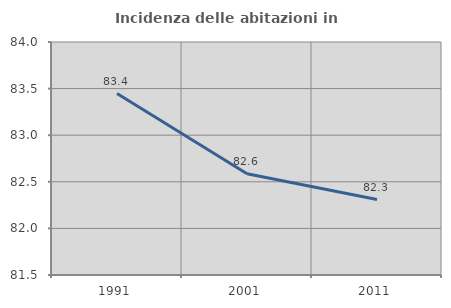
| Category | Incidenza delle abitazioni in proprietà  |
|---|---|
| 1991.0 | 83.447 |
| 2001.0 | 82.587 |
| 2011.0 | 82.31 |